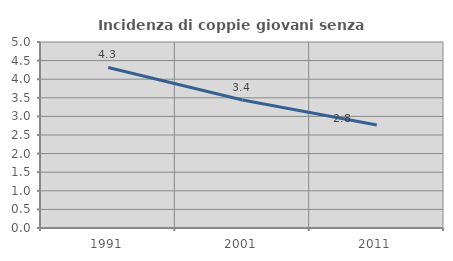
| Category | Incidenza di coppie giovani senza figli |
|---|---|
| 1991.0 | 4.317 |
| 2001.0 | 3.442 |
| 2011.0 | 2.768 |